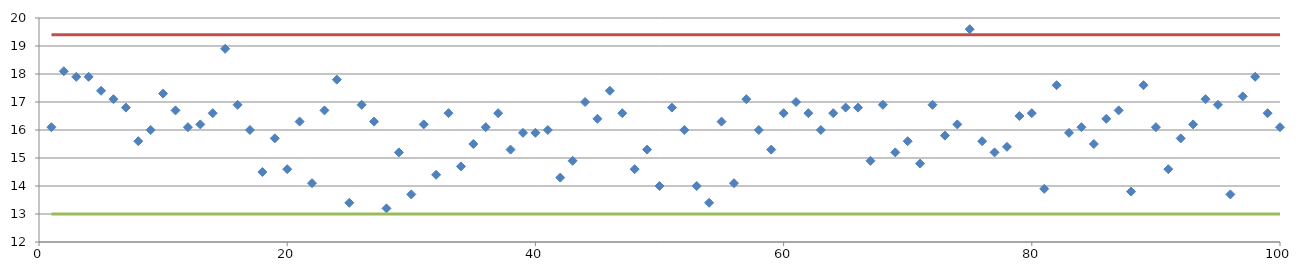
| Category | Series 0 |
|---|---|
| 0 | 16.1 |
| 1 | 18.1 |
| 2 | 17.9 |
| 3 | 17.9 |
| 4 | 17.4 |
| 5 | 17.1 |
| 6 | 16.8 |
| 7 | 15.6 |
| 8 | 16 |
| 9 | 17.3 |
| 10 | 16.7 |
| 11 | 16.1 |
| 12 | 16.2 |
| 13 | 16.6 |
| 14 | 18.9 |
| 15 | 16.9 |
| 16 | 16 |
| 17 | 14.5 |
| 18 | 15.7 |
| 19 | 14.6 |
| 20 | 16.3 |
| 21 | 14.1 |
| 22 | 16.7 |
| 23 | 17.8 |
| 24 | 13.4 |
| 25 | 16.9 |
| 26 | 16.3 |
| 27 | 13.2 |
| 28 | 15.2 |
| 29 | 13.7 |
| 30 | 16.2 |
| 31 | 14.4 |
| 32 | 16.6 |
| 33 | 14.7 |
| 34 | 15.5 |
| 35 | 16.1 |
| 36 | 16.6 |
| 37 | 15.3 |
| 38 | 15.9 |
| 39 | 15.9 |
| 40 | 16 |
| 41 | 14.3 |
| 42 | 14.9 |
| 43 | 17 |
| 44 | 16.4 |
| 45 | 17.4 |
| 46 | 16.6 |
| 47 | 14.6 |
| 48 | 15.3 |
| 49 | 14 |
| 50 | 16.8 |
| 51 | 16 |
| 52 | 14 |
| 53 | 13.4 |
| 54 | 16.3 |
| 55 | 14.1 |
| 56 | 17.1 |
| 57 | 16 |
| 58 | 15.3 |
| 59 | 16.6 |
| 60 | 17 |
| 61 | 16.6 |
| 62 | 16 |
| 63 | 16.6 |
| 64 | 16.8 |
| 65 | 16.8 |
| 66 | 14.9 |
| 67 | 16.9 |
| 68 | 15.2 |
| 69 | 15.6 |
| 70 | 14.8 |
| 71 | 16.9 |
| 72 | 15.8 |
| 73 | 16.2 |
| 74 | 19.6 |
| 75 | 15.6 |
| 76 | 15.2 |
| 77 | 15.4 |
| 78 | 16.5 |
| 79 | 16.6 |
| 80 | 13.9 |
| 81 | 17.6 |
| 82 | 15.9 |
| 83 | 16.1 |
| 84 | 15.5 |
| 85 | 16.4 |
| 86 | 16.7 |
| 87 | 13.8 |
| 88 | 17.6 |
| 89 | 16.1 |
| 90 | 14.6 |
| 91 | 15.7 |
| 92 | 16.2 |
| 93 | 17.1 |
| 94 | 16.9 |
| 95 | 13.7 |
| 96 | 17.2 |
| 97 | 17.9 |
| 98 | 16.6 |
| 99 | 16.1 |